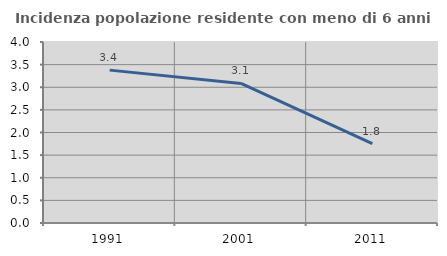
| Category | Incidenza popolazione residente con meno di 6 anni |
|---|---|
| 1991.0 | 3.378 |
| 2001.0 | 3.084 |
| 2011.0 | 1.754 |